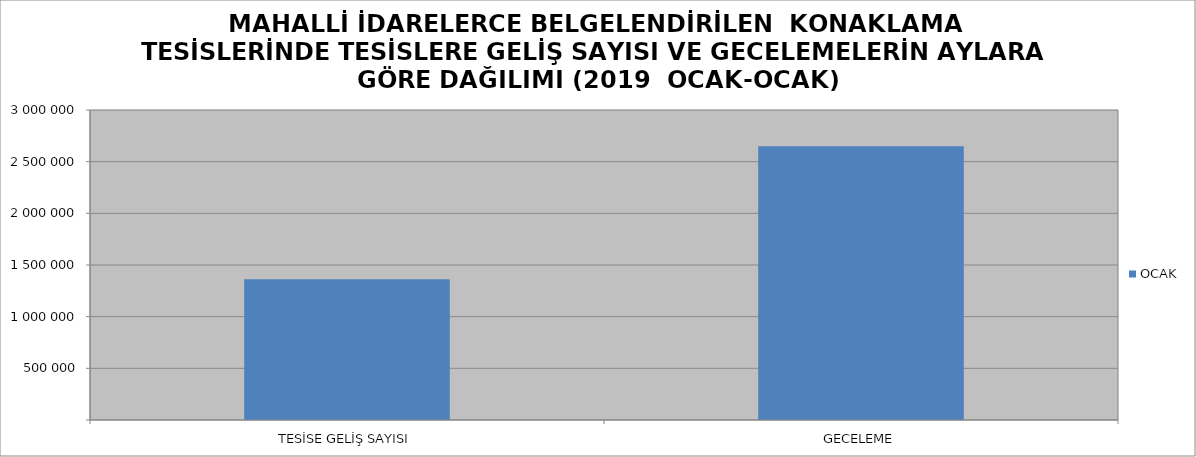
| Category | OCAK |
|---|---|
| TESİSE GELİŞ SAYISI | 1363187 |
| GECELEME | 2649437 |